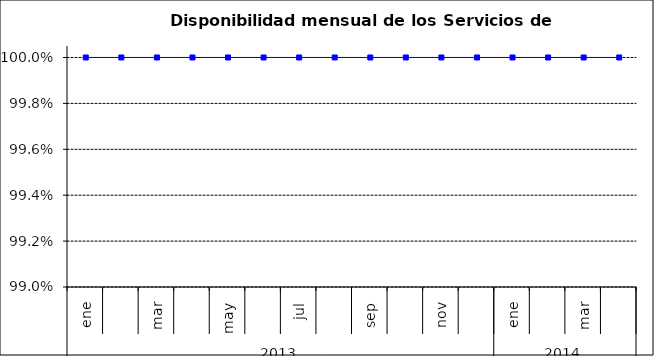
| Category | SCL |
|---|---|
| 0 | 1 |
| 1 | 1 |
| 2 | 1 |
| 3 | 1 |
| 4 | 1 |
| 5 | 1 |
| 6 | 1 |
| 7 | 1 |
| 8 | 1 |
| 9 | 1 |
| 10 | 1 |
| 11 | 1 |
| 12 | 1 |
| 13 | 1 |
| 14 | 1 |
| 15 | 1 |